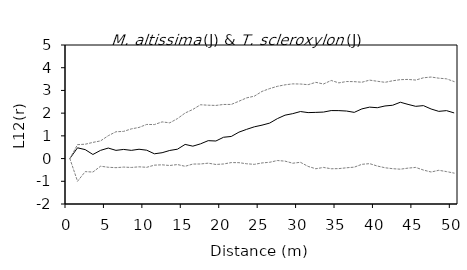
| Category | L12(r) | E12- | E12+ |
|---|---|---|---|
| 0.0 | 0 | 0 | 0 |
| 1.0 | 0.473 | -1 | 0.613 |
| 2.0 | 0.394 | -0.575 | 0.632 |
| 3.0 | 0.18 | -0.593 | 0.712 |
| 4.0 | 0.362 | -0.337 | 0.779 |
| 5.0 | 0.463 | -0.383 | 1.007 |
| 6.0 | 0.361 | -0.401 | 1.18 |
| 7.0 | 0.402 | -0.375 | 1.197 |
| 8.0 | 0.361 | -0.391 | 1.307 |
| 9.0 | 0.411 | -0.363 | 1.371 |
| 10.0 | 0.368 | -0.384 | 1.503 |
| 11.0 | 0.21 | -0.29 | 1.497 |
| 12.0 | 0.257 | -0.275 | 1.615 |
| 13.0 | 0.357 | -0.305 | 1.574 |
| 14.0 | 0.413 | -0.263 | 1.759 |
| 15.0 | 0.623 | -0.34 | 2.006 |
| 16.0 | 0.546 | -0.241 | 2.162 |
| 17.0 | 0.648 | -0.238 | 2.369 |
| 18.0 | 0.788 | -0.202 | 2.349 |
| 19.0 | 0.773 | -0.259 | 2.34 |
| 20.0 | 0.938 | -0.238 | 2.382 |
| 21.0 | 0.973 | -0.177 | 2.383 |
| 22.0 | 1.163 | -0.18 | 2.524 |
| 23.0 | 1.286 | -0.229 | 2.672 |
| 24.0 | 1.398 | -0.254 | 2.747 |
| 25.0 | 1.472 | -0.192 | 2.957 |
| 26.0 | 1.562 | -0.163 | 3.081 |
| 27.0 | 1.758 | -0.086 | 3.18 |
| 28.0 | 1.911 | -0.112 | 3.247 |
| 29.0 | 1.978 | -0.205 | 3.289 |
| 30.0 | 2.071 | -0.164 | 3.282 |
| 31.0 | 2.024 | -0.345 | 3.253 |
| 32.0 | 2.034 | -0.448 | 3.356 |
| 33.0 | 2.047 | -0.39 | 3.283 |
| 34.0 | 2.113 | -0.448 | 3.438 |
| 35.0 | 2.111 | -0.442 | 3.333 |
| 36.0 | 2.093 | -0.406 | 3.392 |
| 37.0 | 2.034 | -0.378 | 3.386 |
| 38.0 | 2.188 | -0.253 | 3.361 |
| 39.0 | 2.264 | -0.223 | 3.454 |
| 40.0 | 2.239 | -0.328 | 3.404 |
| 41.0 | 2.315 | -0.404 | 3.357 |
| 42.0 | 2.348 | -0.446 | 3.425 |
| 43.0 | 2.48 | -0.467 | 3.474 |
| 44.0 | 2.385 | -0.42 | 3.484 |
| 45.0 | 2.299 | -0.39 | 3.457 |
| 46.0 | 2.331 | -0.505 | 3.556 |
| 47.0 | 2.183 | -0.592 | 3.59 |
| 48.0 | 2.078 | -0.516 | 3.539 |
| 49.0 | 2.111 | -0.573 | 3.511 |
| 50.0 | 2.009 | -0.64 | 3.389 |